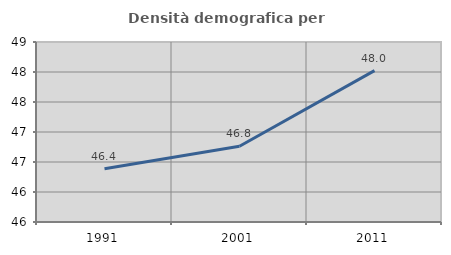
| Category | Densità demografica |
|---|---|
| 1991.0 | 46.386 |
| 2001.0 | 46.762 |
| 2011.0 | 48.023 |